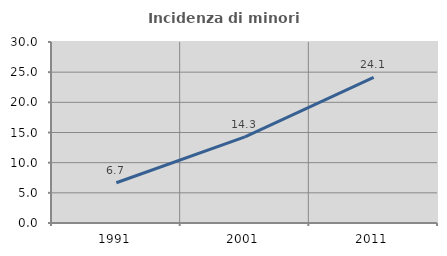
| Category | Incidenza di minori stranieri |
|---|---|
| 1991.0 | 6.667 |
| 2001.0 | 14.286 |
| 2011.0 | 24.131 |